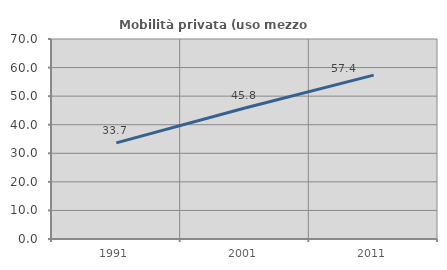
| Category | Mobilità privata (uso mezzo privato) |
|---|---|
| 1991.0 | 33.659 |
| 2001.0 | 45.843 |
| 2011.0 | 57.359 |